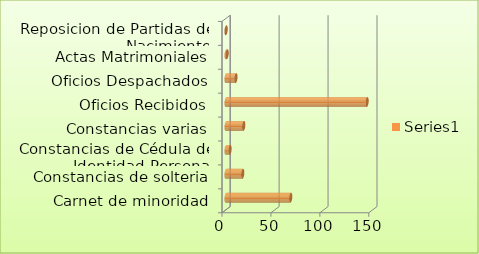
| Category | Series 0 |
|---|---|
| Carnet de minoridad | 66 |
| Constancias de solteria | 17 |
| Constancias de Cédula de Identidad Personal | 4 |
| Constancias varias | 18 |
| Oficios Recibidos | 144 |
| Oficios Despachados | 10 |
| Actas Matrimoniales | 1 |
| Reposicion de Partidas de Nacimiento | 0 |